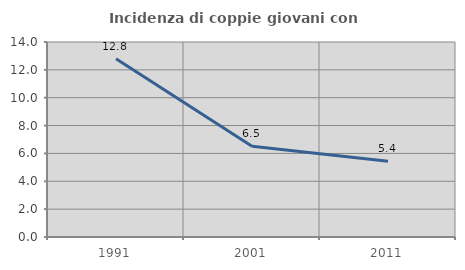
| Category | Incidenza di coppie giovani con figli |
|---|---|
| 1991.0 | 12.802 |
| 2001.0 | 6.508 |
| 2011.0 | 5.437 |